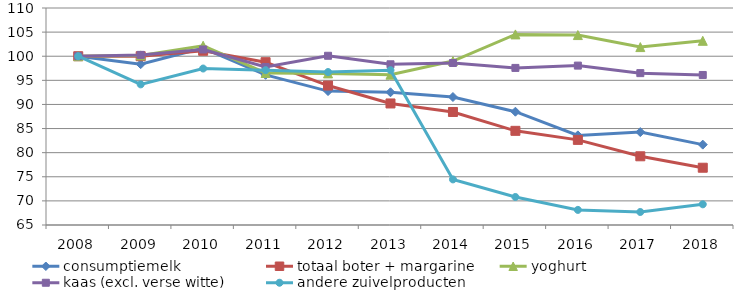
| Category | consumptiemelk | totaal boter + margarine | yoghurt | kaas (excl. verse witte) | andere zuivelproducten |
|---|---|---|---|---|---|
| 2008.0 | 100 | 100 | 100 | 100 | 100 |
| 2009.0 | 98.352 | 100 | 100.174 | 100.279 | 94.164 |
| 2010.0 | 101.686 | 101.126 | 102.172 | 101.395 | 97.45 |
| 2011.0 | 96.142 | 98.761 | 96.525 | 97.767 | 97.11 |
| 2012.0 | 92.77 | 93.919 | 96.438 | 100.093 | 96.714 |
| 2013.0 | 92.527 | 90.203 | 96.177 | 98.326 | 97.11 |
| 2014.0 | 91.538 | 88.439 | 98.999 | 98.598 | 74.456 |
| 2015.0 | 88.493 | 84.527 | 104.522 | 97.574 | 70.807 |
| 2016.0 | 83.585 | 82.652 | 104.388 | 98.054 | 68.134 |
| 2017.0 | 84.264 | 79.25 | 101.895 | 96.492 | 67.698 |
| 2018.0 | 81.667 | 76.877 | 103.198 | 96.112 | 69.292 |